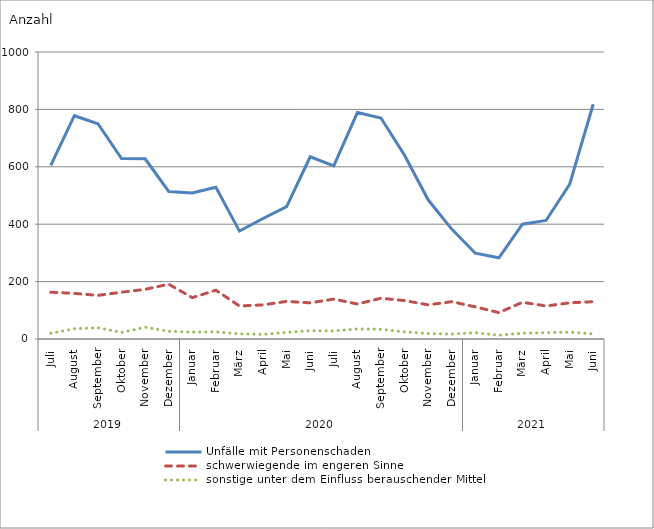
| Category | Unfälle mit Personenschaden | schwerwiegende im engeren Sinne | sonstige unter dem Einfluss berauschender Mittel |
|---|---|---|---|
| 0 | 605 | 163 | 20 |
| 1 | 778 | 159 | 36 |
| 2 | 750 | 152 | 39 |
| 3 | 629 | 163 | 23 |
| 4 | 628 | 173 | 41 |
| 5 | 514 | 191 | 27 |
| 6 | 509 | 144 | 24 |
| 7 | 529 | 170 | 25 |
| 8 | 376 | 115 | 18 |
| 9 | 420 | 119 | 16 |
| 10 | 461 | 131 | 23 |
| 11 | 635 | 126 | 29 |
| 12 | 603 | 139 | 28 |
| 13 | 789 | 122 | 35 |
| 14 | 770 | 142 | 34 |
| 15 | 640 | 134 | 25 |
| 16 | 485 | 119 | 19 |
| 17 | 383 | 130 | 17 |
| 18 | 299 | 112 | 22 |
| 19 | 283 | 92 | 13 |
| 20 | 400 | 128 | 20 |
| 21 | 413 | 115 | 22 |
| 22 | 539 | 126 | 24 |
| 23 | 818 | 130 | 18 |